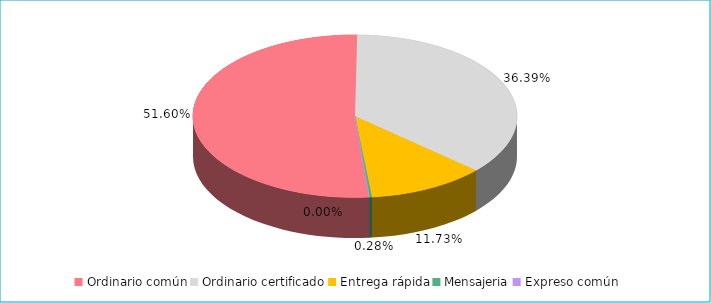
| Category | Series 0 |
|---|---|
| Ordinario común | 0.516 |
| Ordinario certificado | 0.364 |
| Entrega rápida | 0.117 |
| Mensajeria | 0.003 |
| Expreso común | 0 |